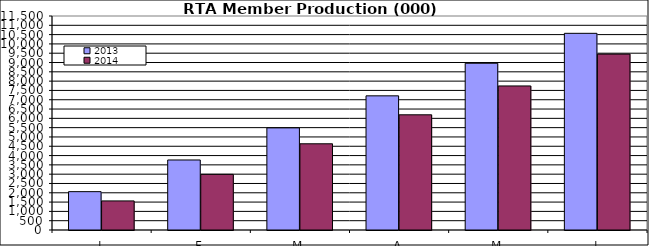
| Category | 2013 | 2014 |
|---|---|---|
| J | 2061.224 | 1562.786 |
| F | 3762.689 | 2990.831 |
| M | 5487.558 | 4632.581 |
| A | 7209.726 | 6190.113 |
| M | 8960.48 | 7741.465 |
| J | 10569.596 | 9452.54 |